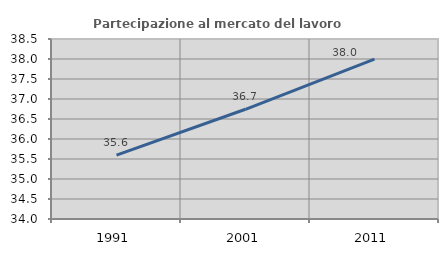
| Category | Partecipazione al mercato del lavoro  femminile |
|---|---|
| 1991.0 | 35.598 |
| 2001.0 | 36.743 |
| 2011.0 | 37.995 |